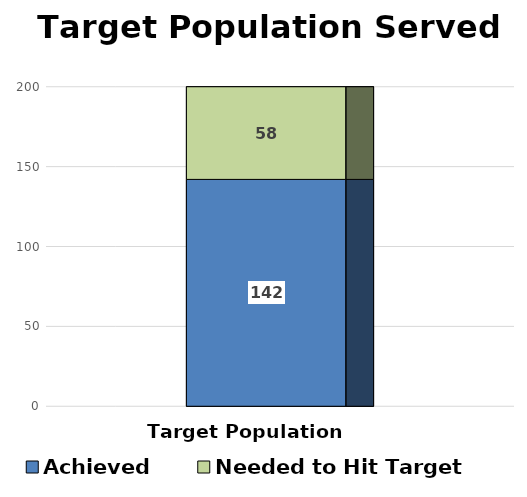
| Category | Achieved | Needed to Hit Target |
|---|---|---|
| Target Population | 142 | 58 |